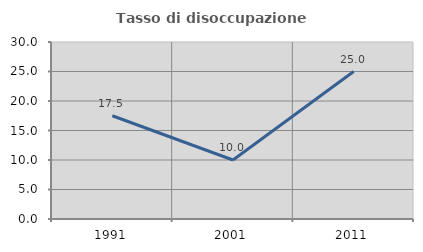
| Category | Tasso di disoccupazione giovanile  |
|---|---|
| 1991.0 | 17.5 |
| 2001.0 | 10 |
| 2011.0 | 25 |